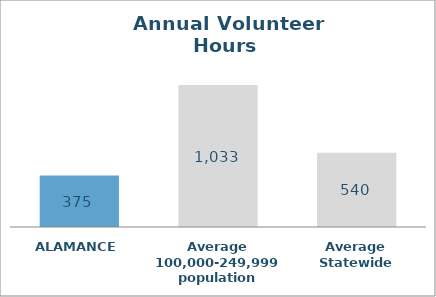
| Category | Series 0 |
|---|---|
| ALAMANCE | 375 |
| Average 100,000-249,999 population | 1032.522 |
| Average Statewide | 539.667 |